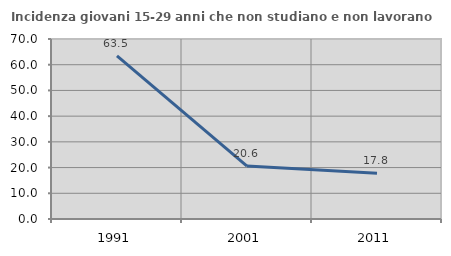
| Category | Incidenza giovani 15-29 anni che non studiano e non lavorano  |
|---|---|
| 1991.0 | 63.474 |
| 2001.0 | 20.574 |
| 2011.0 | 17.838 |